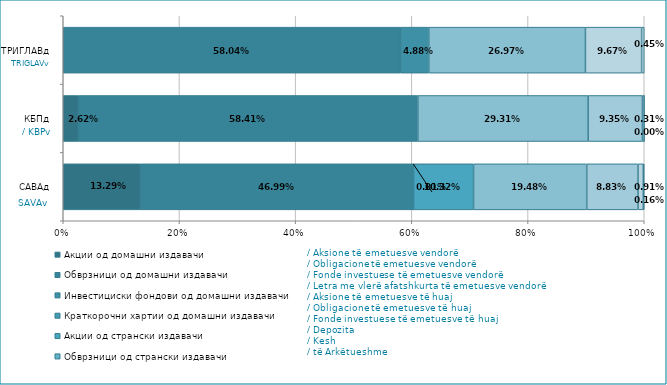
| Category | Акции од домашни издавачи  | Обврзници од домашни издавачи  | Инвестициски фондови од домашни издавачи   | Краткорочни хартии од домашни издавачи   | Акции од странски издавачи   | Обврзници од странски издавачи  | Инвестициски фондови од странски издавчи  | Депозити | Парични средства | Побарувања |
|---|---|---|---|---|---|---|---|---|---|---|
| САВАд | 0.133 | 0.47 | 0 | 0 | 0.103 | 0 | 0.195 | 0.088 | 0.009 | 0.002 |
| КБПд | 0.026 | 0.584 | 0 | 0 | 0 | 0 | 0.293 | 0.094 | 0.003 | 0 |
| ТРИГЛАВд | 0 | 0.58 | 0.049 | 0 | 0 | 0 | 0.27 | 0 | 0.097 | 0.005 |